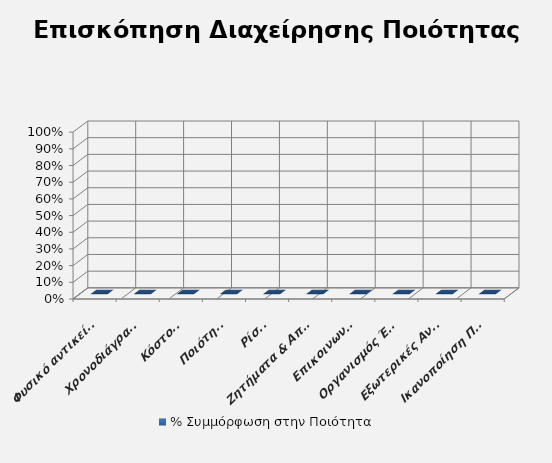
| Category | % Συμμόρφωση στην Ποιότητα |
|---|---|
| Φυσικό αντικείμενο έργου | 0 |
| Χρονοδιάγραμμα | 0 |
| Κόστος  | 0 |
| Ποιότητα | 0 |
| Ρίσκο | 0 |
| Ζητήματα & Αποφάσεις  | 0 |
| Επικοινωνία  | 0 |
| Οργανισμός Έργου | 0 |
| Εξωτερικές Αναθέσεις | 0 |
| Ικανοποίηση Πελάτη | 0 |